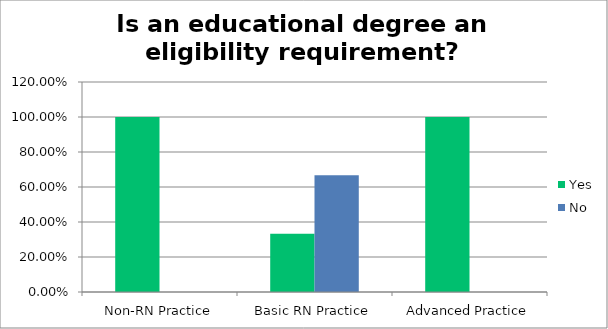
| Category | Yes | No |
|---|---|---|
| Non-RN Practice | 1 | 0 |
| Basic RN Practice | 0.333 | 0.667 |
| Advanced Practice | 1 | 0 |